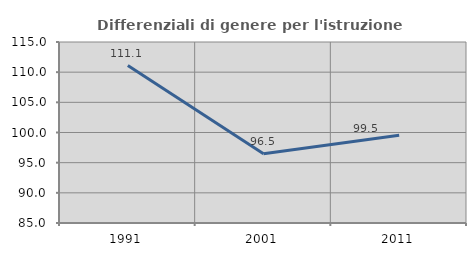
| Category | Differenziali di genere per l'istruzione superiore |
|---|---|
| 1991.0 | 111.092 |
| 2001.0 | 96.489 |
| 2011.0 | 99.534 |